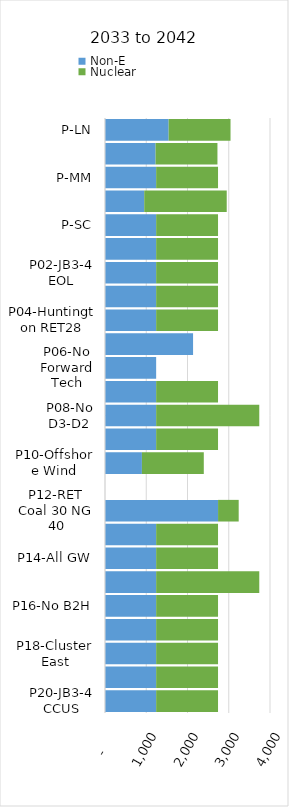
| Category | Non-E | Nuclear |
|---|---|---|
| P-LN | 1543 | 1500 |
| P-MN | 1226 | 1500 |
| P-MM | 1240 | 1500 |
| P-HH | 951 | 2000 |
| P-SC | 1240 | 1500 |
| P01-JB3-4 GC | 1240 | 1500 |
| P02-JB3-4 EOL | 1240 | 1500 |
| P03-Hunter3-SCR | 1240 | 1500 |
| P04-Huntington RET28 | 1240 | 1500 |
| P05-No NUC | 2135 | 0 |
| P06-No Forward Tech | 1240 | 0 |
| P07-D3-D2 32 | 1240 | 1500 |
| P08-No D3-D2 | 1240 | 2500 |
| P09-No WY OTR | 1240 | 1500 |
| P10-Offshore Wind | 895 | 1500 |
| P11-Max NG | 0 | 0 |
| P12-RET Coal 30 NG 40 | 2741 | 500 |
| P13-All EE | 1240 | 1500 |
| P14-All GW | 1240 | 1500 |
| P15-No GWS | 1240 | 2500 |
| P16-No B2H | 1240 | 1500 |
| P17-Col3-4 RET25 | 1240 | 1500 |
| P18-Cluster East | 1240 | 1500 |
| P19-Cluster West | 1240 | 1500 |
| P20-JB3-4 CCUS | 1240 | 1500 |